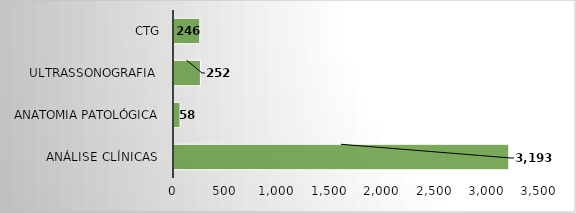
| Category | Series 0 |
|---|---|
| Análise Clínicas  | 3193 |
| Anatomia Patológica | 58 |
| Ultrassonografia  | 252 |
| CTG | 246 |